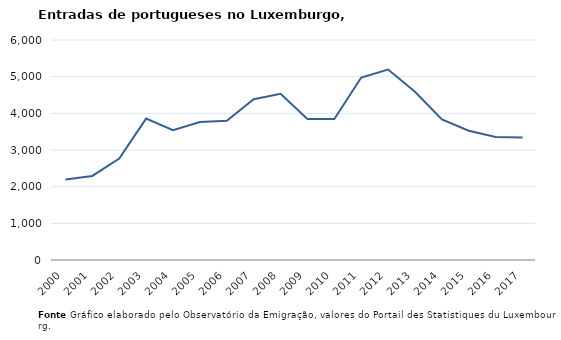
| Category | Entradas |
|---|---|
| 2000.0 | 2193 |
| 2001.0 | 2293 |
| 2002.0 | 2767 |
| 2003.0 | 3857 |
| 2004.0 | 3542 |
| 2005.0 | 3761 |
| 2006.0 | 3796 |
| 2007.0 | 4385 |
| 2008.0 | 4531 |
| 2009.0 | 3844 |
| 2010.0 | 3845 |
| 2011.0 | 4977 |
| 2012.0 | 5193 |
| 2013.0 | 4590 |
| 2014.0 | 3832 |
| 2015.0 | 3525 |
| 2016.0 | 3355 |
| 2017.0 | 3342 |